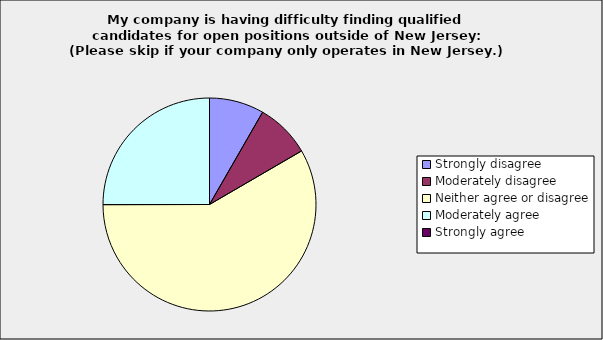
| Category | Series 0 |
|---|---|
| Strongly disagree | 0.083 |
| Moderately disagree | 0.083 |
| Neither agree or disagree | 0.583 |
| Moderately agree | 0.25 |
| Strongly agree | 0 |